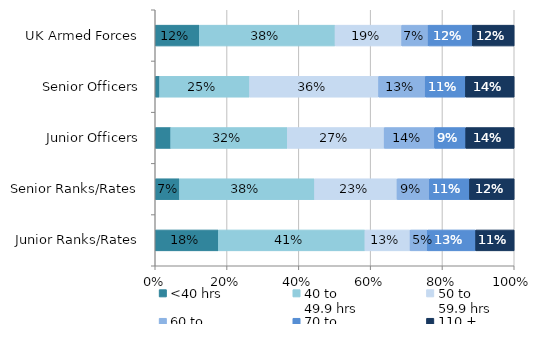
| Category | <40 hrs | 40 to 
49.9 hrs | 50 to 
59.9 hrs | 60 to 
69.9 hrs | 70 to 
109.9 hrs | 110 + 
hrs |
|---|---|---|---|---|---|---|
| UK Armed Forces | 0.123 | 0.378 | 0.186 | 0.074 | 0.123 | 0.117 |
| Senior Officers | 0.012 | 0.251 | 0.359 | 0.13 | 0.112 | 0.136 |
| Junior Officers | 0.043 | 0.325 | 0.27 | 0.14 | 0.087 | 0.135 |
| Senior Ranks/Rates | 0.068 | 0.376 | 0.23 | 0.09 | 0.112 | 0.124 |
| Junior Ranks/Rates | 0.176 | 0.408 | 0.126 | 0.048 | 0.135 | 0.107 |